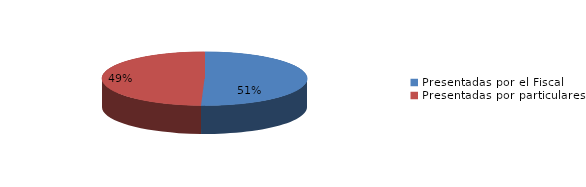
| Category | Series 0 |
|---|---|
| Presentadas por el Fiscal | 94 |
| Presentadas por particulares | 92 |